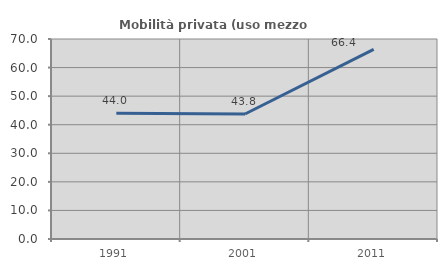
| Category | Mobilità privata (uso mezzo privato) |
|---|---|
| 1991.0 | 44.037 |
| 2001.0 | 43.75 |
| 2011.0 | 66.372 |